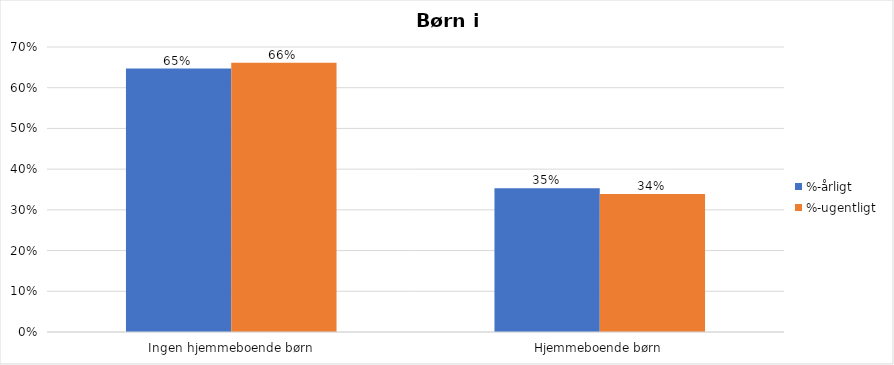
| Category | %-årligt | %-ugentligt |
|---|---|---|
| Ingen hjemmeboende børn | 0.647 | 0.661 |
| Hjemmeboende børn | 0.353 | 0.339 |